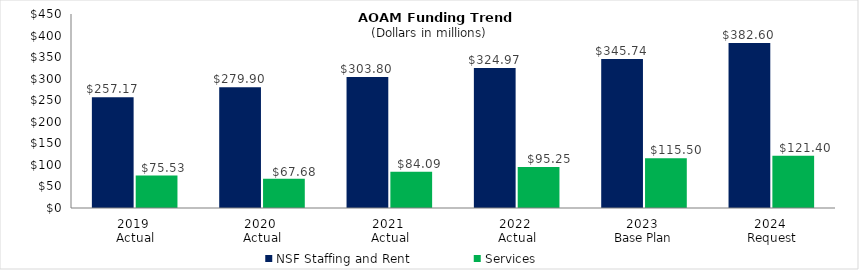
| Category | NSF Staffing and Rent | Services |
|---|---|---|
| 2019 
Actual | 257.17 | 75.533 |
| 2020 
Actual | 279.901 | 67.682 |
| 2021 
Actual | 303.803 | 84.088 |
| 2022 
Actual | 324.966 | 95.247 |
| 2023 
Base Plan | 345.742 | 115.502 |
| 2025 
Request | 382.6 | 121.4 |